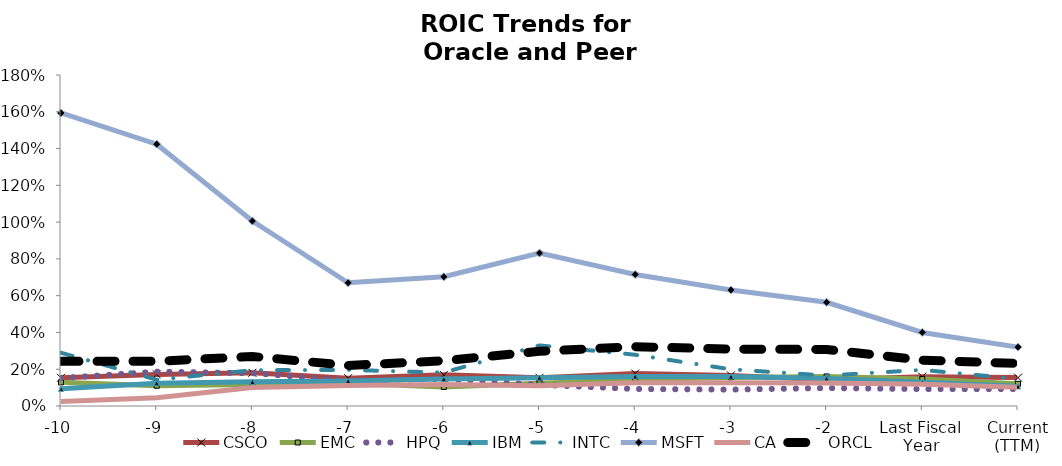
| Category | CSCO | EMC | HPQ | IBM | INTC | MSFT | CA | ORCL |
|---|---|---|---|---|---|---|---|---|
| -10 | 0.153 | 0.129 | 0.152 | 0.093 | 0.29 | 1.594 | 0.025 | 0.243 |
| -9 | 0.172 | 0.11 | 0.187 | 0.124 | 0.143 | 1.424 | 0.045 | 0.243 |
| -8 | 0.181 | 0.117 | 0.178 | 0.131 | 0.195 | 1.006 | 0.101 | 0.269 |
| -7 | 0.151 | 0.123 | 0.138 | 0.136 | 0.196 | 0.67 | 0.112 | 0.221 |
| -6 | 0.169 | 0.104 | 0.148 | 0.147 | 0.182 | 0.703 | 0.117 | 0.246 |
| -5 | 0.154 | 0.124 | 0.115 | 0.154 | 0.329 | 0.832 | 0.11 | 0.298 |
| -4 | 0.177 | 0.142 | 0.092 | 0.161 | 0.279 | 0.715 | 0.126 | 0.323 |
| -3 | 0.166 | 0.155 | 0.089 | 0.16 | 0.199 | 0.631 | 0.126 | 0.309 |
| -2 | 0.143 | 0.161 | 0.098 | 0.149 | 0.166 | 0.564 | 0.126 | 0.308 |
| Last Fiscal Year | 0.159 | 0.147 | 0.092 | 0.129 | 0.196 | 0.4 | 0.119 | 0.249 |
| Current (TTM) | 0.154 | 0.121 | 0.092 | 0.106 | 0.147 | 0.32 | 0.102 | 0.231 |